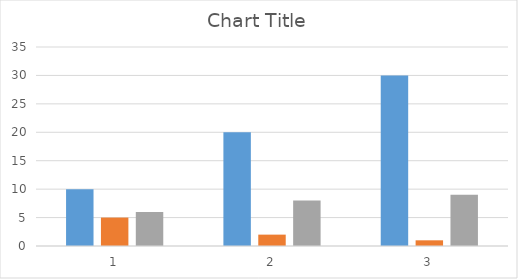
| Category | Series 0 | Series 1 | Series 2 |
|---|---|---|---|
| 0 | 10 | 5 | 6 |
| 1 | 20 | 2 | 8 |
| 2 | 30 | 1 | 9 |